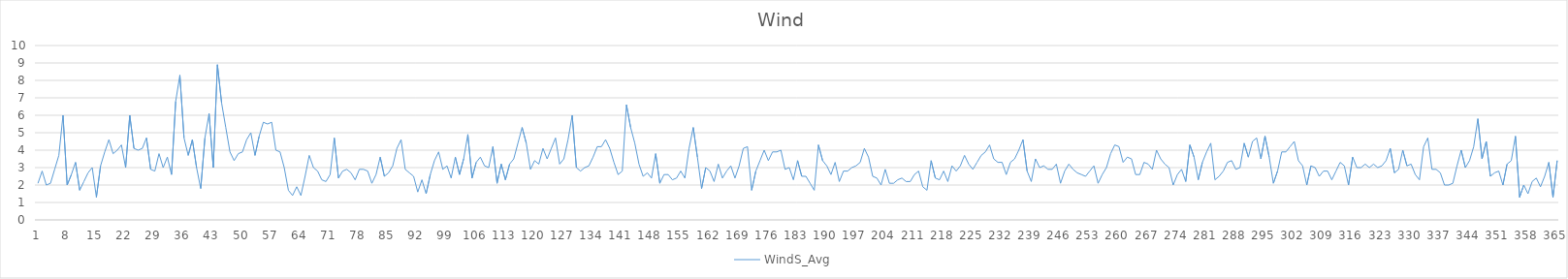
| Category | WindS_Avg |
|---|---|
| 0 | 2.1 |
| 1 | 2.8 |
| 2 | 2 |
| 3 | 2.1 |
| 4 | 2.9 |
| 5 | 3.7 |
| 6 | 6 |
| 7 | 2 |
| 8 | 2.6 |
| 9 | 3.3 |
| 10 | 1.7 |
| 11 | 2.2 |
| 12 | 2.7 |
| 13 | 3 |
| 14 | 1.3 |
| 15 | 3.1 |
| 16 | 3.9 |
| 17 | 4.6 |
| 18 | 3.8 |
| 19 | 4 |
| 20 | 4.3 |
| 21 | 3 |
| 22 | 6 |
| 23 | 4.1 |
| 24 | 4 |
| 25 | 4.1 |
| 26 | 4.7 |
| 27 | 2.9 |
| 28 | 2.8 |
| 29 | 3.8 |
| 30 | 3 |
| 31 | 3.6 |
| 32 | 2.6 |
| 33 | 6.8 |
| 34 | 8.3 |
| 35 | 4.7 |
| 36 | 3.7 |
| 37 | 4.6 |
| 38 | 3 |
| 39 | 1.8 |
| 40 | 4.7 |
| 41 | 6.1 |
| 42 | 3 |
| 43 | 8.9 |
| 44 | 6.7 |
| 45 | 5.3 |
| 46 | 3.9 |
| 47 | 3.4 |
| 48 | 3.8 |
| 49 | 3.9 |
| 50 | 4.6 |
| 51 | 5 |
| 52 | 3.7 |
| 53 | 4.8 |
| 54 | 5.6 |
| 55 | 5.5 |
| 56 | 5.6 |
| 57 | 4 |
| 58 | 3.9 |
| 59 | 3 |
| 60 | 1.7 |
| 61 | 1.4 |
| 62 | 1.9 |
| 63 | 1.4 |
| 64 | 2.5 |
| 65 | 3.7 |
| 66 | 3 |
| 67 | 2.8 |
| 68 | 2.3 |
| 69 | 2.2 |
| 70 | 2.6 |
| 71 | 4.7 |
| 72 | 2.4 |
| 73 | 2.8 |
| 74 | 2.9 |
| 75 | 2.7 |
| 76 | 2.3 |
| 77 | 2.9 |
| 78 | 2.9 |
| 79 | 2.8 |
| 80 | 2.1 |
| 81 | 2.6 |
| 82 | 3.6 |
| 83 | 2.5 |
| 84 | 2.7 |
| 85 | 3.1 |
| 86 | 4.1 |
| 87 | 4.6 |
| 88 | 2.9 |
| 89 | 2.7 |
| 90 | 2.5 |
| 91 | 1.6 |
| 92 | 2.3 |
| 93 | 1.5 |
| 94 | 2.6 |
| 95 | 3.4 |
| 96 | 3.9 |
| 97 | 2.9 |
| 98 | 3.1 |
| 99 | 2.4 |
| 100 | 3.6 |
| 101 | 2.6 |
| 102 | 3.5 |
| 103 | 4.9 |
| 104 | 2.4 |
| 105 | 3.3 |
| 106 | 3.6 |
| 107 | 3.1 |
| 108 | 3 |
| 109 | 4.2 |
| 110 | 2.1 |
| 111 | 3.2 |
| 112 | 2.3 |
| 113 | 3.2 |
| 114 | 3.5 |
| 115 | 4.4 |
| 116 | 5.3 |
| 117 | 4.4 |
| 118 | 2.9 |
| 119 | 3.4 |
| 120 | 3.2 |
| 121 | 4.1 |
| 122 | 3.5 |
| 123 | 4.1 |
| 124 | 4.7 |
| 125 | 3.2 |
| 126 | 3.5 |
| 127 | 4.6 |
| 128 | 6 |
| 129 | 3 |
| 130 | 2.8 |
| 131 | 3 |
| 132 | 3.1 |
| 133 | 3.6 |
| 134 | 4.2 |
| 135 | 4.2 |
| 136 | 4.6 |
| 137 | 4.1 |
| 138 | 3.3 |
| 139 | 2.6 |
| 140 | 2.8 |
| 141 | 6.6 |
| 142 | 5.3 |
| 143 | 4.4 |
| 144 | 3.2 |
| 145 | 2.5 |
| 146 | 2.7 |
| 147 | 2.4 |
| 148 | 3.8 |
| 149 | 2.1 |
| 150 | 2.6 |
| 151 | 2.6 |
| 152 | 2.3 |
| 153 | 2.4 |
| 154 | 2.8 |
| 155 | 2.4 |
| 156 | 4.1 |
| 157 | 5.3 |
| 158 | 3.6 |
| 159 | 1.8 |
| 160 | 3 |
| 161 | 2.8 |
| 162 | 2.2 |
| 163 | 3.2 |
| 164 | 2.4 |
| 165 | 2.8 |
| 166 | 3.1 |
| 167 | 2.4 |
| 168 | 3.1 |
| 169 | 4.1 |
| 170 | 4.2 |
| 171 | 1.7 |
| 172 | 2.8 |
| 173 | 3.4 |
| 174 | 4 |
| 175 | 3.4 |
| 176 | 3.9 |
| 177 | 3.9 |
| 178 | 4 |
| 179 | 2.9 |
| 180 | 3 |
| 181 | 2.3 |
| 182 | 3.4 |
| 183 | 2.5 |
| 184 | 2.5 |
| 185 | 2.1 |
| 186 | 1.7 |
| 187 | 4.3 |
| 188 | 3.4 |
| 189 | 3.1 |
| 190 | 2.6 |
| 191 | 3.3 |
| 192 | 2.2 |
| 193 | 2.8 |
| 194 | 2.8 |
| 195 | 3 |
| 196 | 3.1 |
| 197 | 3.3 |
| 198 | 4.1 |
| 199 | 3.6 |
| 200 | 2.5 |
| 201 | 2.4 |
| 202 | 2 |
| 203 | 2.9 |
| 204 | 2.1 |
| 205 | 2.1 |
| 206 | 2.3 |
| 207 | 2.4 |
| 208 | 2.2 |
| 209 | 2.2 |
| 210 | 2.6 |
| 211 | 2.8 |
| 212 | 1.9 |
| 213 | 1.7 |
| 214 | 3.4 |
| 215 | 2.4 |
| 216 | 2.3 |
| 217 | 2.8 |
| 218 | 2.2 |
| 219 | 3.1 |
| 220 | 2.8 |
| 221 | 3.1 |
| 222 | 3.7 |
| 223 | 3.2 |
| 224 | 2.9 |
| 225 | 3.3 |
| 226 | 3.7 |
| 227 | 3.9 |
| 228 | 4.3 |
| 229 | 3.5 |
| 230 | 3.3 |
| 231 | 3.3 |
| 232 | 2.6 |
| 233 | 3.3 |
| 234 | 3.5 |
| 235 | 4 |
| 236 | 4.6 |
| 237 | 2.8 |
| 238 | 2.2 |
| 239 | 3.5 |
| 240 | 3 |
| 241 | 3.1 |
| 242 | 2.9 |
| 243 | 2.9 |
| 244 | 3.2 |
| 245 | 2.1 |
| 246 | 2.8 |
| 247 | 3.2 |
| 248 | 2.9 |
| 249 | 2.7 |
| 250 | 2.6 |
| 251 | 2.5 |
| 252 | 2.8 |
| 253 | 3.1 |
| 254 | 2.1 |
| 255 | 2.6 |
| 256 | 3 |
| 257 | 3.8 |
| 258 | 4.3 |
| 259 | 4.2 |
| 260 | 3.3 |
| 261 | 3.6 |
| 262 | 3.5 |
| 263 | 2.6 |
| 264 | 2.6 |
| 265 | 3.3 |
| 266 | 3.2 |
| 267 | 2.9 |
| 268 | 4 |
| 269 | 3.5 |
| 270 | 3.2 |
| 271 | 3 |
| 272 | 2 |
| 273 | 2.6 |
| 274 | 2.9 |
| 275 | 2.2 |
| 276 | 4.3 |
| 277 | 3.6 |
| 278 | 2.3 |
| 279 | 3.3 |
| 280 | 3.9 |
| 281 | 4.4 |
| 282 | 2.3 |
| 283 | 2.5 |
| 284 | 2.8 |
| 285 | 3.3 |
| 286 | 3.4 |
| 287 | 2.9 |
| 288 | 3 |
| 289 | 4.4 |
| 290 | 3.6 |
| 291 | 4.5 |
| 292 | 4.7 |
| 293 | 3.5 |
| 294 | 4.8 |
| 295 | 3.6 |
| 296 | 2.1 |
| 297 | 2.8 |
| 298 | 3.9 |
| 299 | 3.9 |
| 300 | 4.2 |
| 301 | 4.5 |
| 302 | 3.4 |
| 303 | 3.1 |
| 304 | 2 |
| 305 | 3.1 |
| 306 | 3 |
| 307 | 2.5 |
| 308 | 2.8 |
| 309 | 2.8 |
| 310 | 2.3 |
| 311 | 2.8 |
| 312 | 3.3 |
| 313 | 3.1 |
| 314 | 2 |
| 315 | 3.6 |
| 316 | 3 |
| 317 | 3 |
| 318 | 3.2 |
| 319 | 3 |
| 320 | 3.2 |
| 321 | 3 |
| 322 | 3.1 |
| 323 | 3.4 |
| 324 | 4.1 |
| 325 | 2.7 |
| 326 | 2.9 |
| 327 | 4 |
| 328 | 3.1 |
| 329 | 3.2 |
| 330 | 2.6 |
| 331 | 2.3 |
| 332 | 4.2 |
| 333 | 4.7 |
| 334 | 2.9 |
| 335 | 2.9 |
| 336 | 2.7 |
| 337 | 2 |
| 338 | 2 |
| 339 | 2.1 |
| 340 | 3.1 |
| 341 | 4 |
| 342 | 3 |
| 343 | 3.4 |
| 344 | 4.2 |
| 345 | 5.8 |
| 346 | 3.5 |
| 347 | 4.5 |
| 348 | 2.5 |
| 349 | 2.7 |
| 350 | 2.8 |
| 351 | 2 |
| 352 | 3.2 |
| 353 | 3.4 |
| 354 | 4.8 |
| 355 | 1.3 |
| 356 | 2 |
| 357 | 1.5 |
| 358 | 2.2 |
| 359 | 2.4 |
| 360 | 1.9 |
| 361 | 2.5 |
| 362 | 3.3 |
| 363 | 1.3 |
| 364 | 3.4 |